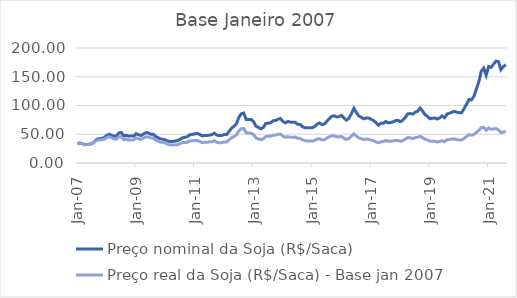
| Category | Preço nominal da Soja (R$/Saca) | Preço real da Soja (R$/Saca) - Base jan 2007 |
|---|---|---|
| 2007-01-01 | 33.676 | 33.676 |
| 2007-02-01 | 34.71 | 34.629 |
| 2007-03-01 | 34.005 | 33.852 |
| 2007-04-01 | 31.955 | 31.768 |
| 2007-05-01 | 32.124 | 31.886 |
| 2007-06-01 | 32.944 | 32.615 |
| 2007-07-01 | 33.651 | 33.192 |
| 2007-08-01 | 37.106 | 36.096 |
| 2007-09-01 | 41.301 | 39.714 |
| 2007-10-01 | 42.199 | 40.276 |
| 2007-11-01 | 42.959 | 40.576 |
| 2007-12-01 | 44.03 | 40.984 |
| 2008-01-01 | 47.928 | 44.176 |
| 2008-02-01 | 49.993 | 45.906 |
| 2008-03-01 | 48.061 | 43.824 |
| 2008-04-01 | 46.722 | 42.133 |
| 2008-05-01 | 46.654 | 41.297 |
| 2008-06-01 | 52.353 | 45.481 |
| 2008-07-01 | 52.961 | 45.499 |
| 2008-08-01 | 46.838 | 40.393 |
| 2008-09-01 | 48.141 | 41.367 |
| 2008-10-01 | 46.654 | 39.655 |
| 2008-11-01 | 47.32 | 40.195 |
| 2008-12-01 | 46.731 | 39.871 |
| 2009-01-01 | 51.018 | 43.522 |
| 2009-02-01 | 49.236 | 42.055 |
| 2009-03-01 | 47.665 | 41.057 |
| 2009-04-01 | 50.16 | 43.187 |
| 2009-05-01 | 52.781 | 45.364 |
| 2009-06-01 | 52.368 | 45.152 |
| 2009-07-01 | 49.935 | 43.333 |
| 2009-08-01 | 50.058 | 43.399 |
| 2009-09-01 | 46.267 | 40.014 |
| 2009-10-01 | 43.962 | 38.036 |
| 2009-11-01 | 42.012 | 36.323 |
| 2009-12-01 | 41.384 | 35.821 |
| 2010-01-01 | 40.216 | 34.463 |
| 2010-02-01 | 38.241 | 32.415 |
| 2010-03-01 | 37.384 | 31.49 |
| 2010-04-01 | 37.433 | 31.306 |
| 2010-05-01 | 38.397 | 31.616 |
| 2010-06-01 | 38.907 | 31.927 |
| 2010-07-01 | 41.365 | 33.871 |
| 2010-08-01 | 43.835 | 35.503 |
| 2010-09-01 | 44.747 | 35.849 |
| 2010-10-01 | 45.721 | 36.255 |
| 2010-11-01 | 49.172 | 38.386 |
| 2010-12-01 | 49.591 | 38.566 |
| 2011-01-01 | 50.779 | 39.108 |
| 2011-02-01 | 51.39 | 39.204 |
| 2011-03-01 | 49.544 | 37.566 |
| 2011-04-01 | 47.186 | 35.602 |
| 2011-05-01 | 47.83 | 36.085 |
| 2011-06-01 | 47.878 | 36.169 |
| 2011-07-01 | 48.502 | 36.659 |
| 2011-08-01 | 49.383 | 37.097 |
| 2011-09-01 | 51.937 | 38.724 |
| 2011-10-01 | 48.468 | 35.995 |
| 2011-11-01 | 47.736 | 35.301 |
| 2011-12-01 | 47.699 | 35.33 |
| 2012-01-01 | 49.552 | 36.593 |
| 2012-02-01 | 49.324 | 36.398 |
| 2012-03-01 | 54.927 | 40.309 |
| 2012-04-01 | 60.344 | 43.839 |
| 2012-05-01 | 63.788 | 45.922 |
| 2012-06-01 | 68.048 | 48.654 |
| 2012-07-01 | 79.356 | 55.892 |
| 2012-08-01 | 85.574 | 59.503 |
| 2012-09-01 | 86.824 | 59.845 |
| 2012-10-01 | 75.73 | 52.363 |
| 2012-11-01 | 75.73 | 52.232 |
| 2012-12-01 | 75.73 | 51.89 |
| 2013-01-01 | 71.992 | 49.178 |
| 2013-02-01 | 64.008 | 43.637 |
| 2013-03-01 | 61.838 | 42.03 |
| 2013-04-01 | 59.449 | 40.429 |
| 2013-05-01 | 61.888 | 41.953 |
| 2013-06-01 | 68.723 | 46.234 |
| 2013-07-01 | 69.319 | 46.569 |
| 2013-08-01 | 69.884 | 46.733 |
| 2013-09-01 | 73.469 | 48.472 |
| 2013-10-01 | 73.839 | 48.413 |
| 2013-11-01 | 76.35 | 49.921 |
| 2013-12-01 | 77.25 | 50.164 |
| 2014-01-01 | 72.059 | 46.605 |
| 2014-02-01 | 69.859 | 44.804 |
| 2014-03-01 | 72.27 | 45.672 |
| 2014-04-01 | 71.111 | 44.738 |
| 2014-05-01 | 70.742 | 44.709 |
| 2014-06-01 | 70.858 | 45.067 |
| 2014-07-01 | 67.297 | 43.04 |
| 2014-08-01 | 67.106 | 42.89 |
| 2014-09-01 | 63.063 | 40.299 |
| 2014-10-01 | 61.17 | 38.859 |
| 2014-11-01 | 61.17 | 38.421 |
| 2014-12-01 | 61.17 | 38.274 |
| 2015-01-01 | 61.143 | 38.003 |
| 2015-02-01 | 63.718 | 39.392 |
| 2015-03-01 | 67.9 | 41.475 |
| 2015-04-01 | 69.526 | 42.083 |
| 2015-05-01 | 66.608 | 40.155 |
| 2015-06-01 | 67.876 | 40.641 |
| 2015-07-01 | 72.893 | 43.393 |
| 2015-08-01 | 77.329 | 45.85 |
| 2015-09-01 | 81.345 | 47.554 |
| 2015-10-01 | 81.978 | 47.096 |
| 2015-11-01 | 79.973 | 45.401 |
| 2015-12-01 | 80.758 | 45.645 |
| 2016-01-01 | 82.746 | 46.063 |
| 2016-02-01 | 77.829 | 42.987 |
| 2016-03-01 | 74.528 | 40.986 |
| 2016-04-01 | 78.043 | 42.763 |
| 2016-05-01 | 86.425 | 46.827 |
| 2016-06-01 | 95.188 | 50.746 |
| 2016-07-01 | 87.464 | 46.81 |
| 2016-08-01 | 81.692 | 43.532 |
| 2016-09-01 | 79.5 | 42.35 |
| 2016-10-01 | 76.703 | 40.806 |
| 2016-11-01 | 78.273 | 41.619 |
| 2016-12-01 | 78.429 | 41.358 |
| 2017-01-01 | 76.034 | 39.922 |
| 2017-02-01 | 73.862 | 38.758 |
| 2017-03-01 | 70.006 | 36.874 |
| 2017-04-01 | 65.82 | 35.105 |
| 2017-05-01 | 68.937 | 36.957 |
| 2017-06-01 | 68.951 | 37.323 |
| 2017-07-01 | 72.241 | 39.22 |
| 2017-08-01 | 69.827 | 37.851 |
| 2017-09-01 | 70.411 | 37.901 |
| 2017-10-01 | 71.47 | 38.433 |
| 2017-11-01 | 73.874 | 39.41 |
| 2017-12-01 | 74.237 | 39.148 |
| 2018-01-01 | 71.83 | 37.716 |
| 2018-02-01 | 74.719 | 39.207 |
| 2018-03-01 | 79.395 | 41.505 |
| 2018-04-01 | 85.532 | 44.303 |
| 2018-05-01 | 86.123 | 43.889 |
| 2018-06-01 | 84.828 | 42.599 |
| 2018-07-01 | 88.294 | 44.144 |
| 2018-08-01 | 89.91 | 44.65 |
| 2018-09-01 | 95.483 | 46.584 |
| 2018-10-01 | 90.535 | 44.054 |
| 2018-11-01 | 84.156 | 41.424 |
| 2018-12-01 | 81.102 | 40.101 |
| 2019-01-01 | 76.891 | 37.993 |
| 2019-02-01 | 77.749 | 37.941 |
| 2019-03-01 | 78.286 | 37.798 |
| 2019-04-01 | 76.563 | 36.635 |
| 2019-05-01 | 78.361 | 37.346 |
| 2019-06-01 | 81.898 | 38.787 |
| 2019-07-01 | 78.817 | 37.331 |
| 2019-08-01 | 85.084 | 40.504 |
| 2019-09-01 | 86.5 | 40.972 |
| 2019-10-01 | 88.251 | 41.573 |
| 2019-11-01 | 89.875 | 41.981 |
| 2019-12-01 | 88.152 | 40.472 |
| 2020-01-01 | 87.391 | 40.085 |
| 2020-02-01 | 87.609 | 40.18 |
| 2020-03-01 | 94.969 | 42.851 |
| 2020-04-01 | 102.298 | 46.135 |
| 2020-05-01 | 110.408 | 49.265 |
| 2020-06-01 | 109.763 | 48.205 |
| 2020-07-01 | 116.054 | 49.803 |
| 2020-08-01 | 128.592 | 53.126 |
| 2020-09-01 | 141.199 | 56.471 |
| 2020-10-01 | 159.635 | 61.578 |
| 2020-11-01 | 164.992 | 62.011 |
| 2020-12-01 | 152.562 | 56.907 |
| 2021-01-01 | 167.865 | 60.846 |
| 2021-02-01 | 166.383 | 58.72 |
| 2021-03-01 | 171.867 | 59.366 |
| 2021-04-01 | 177.098 | 59.846 |
| 2021-05-01 | 176.394 | 57.649 |
| 2021-06-01 | 162.076 | 52.911 |
| 2021-07-01 | 167.597 | 53.933 |
| 2021-08-01 | 171.058 | 55.123 |